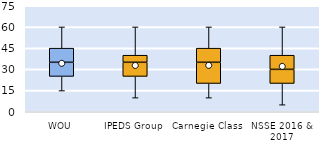
| Category | 25th | 50th | 75th |
|---|---|---|---|
| WOU | 25 | 10 | 10 |
| IPEDS Group | 25 | 10 | 5 |
| Carnegie Class | 20 | 15 | 10 |
| NSSE 2016 & 2017 | 20 | 10 | 10 |